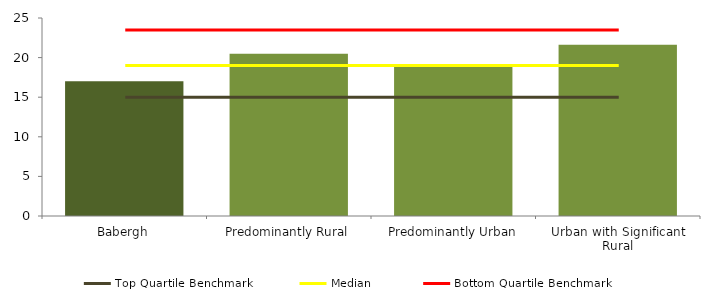
| Category | Series 0 |
|---|---|
| Babergh | 17 |
| Predominantly Rural | 20.483 |
| Predominantly Urban | 18.841 |
| Urban with Significant Rural | 21.629 |